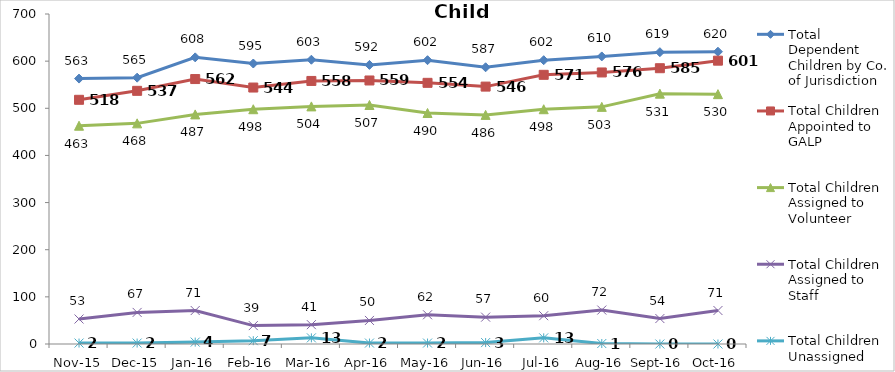
| Category | Total Dependent Children by Co. of Jurisdiction | Total Children Appointed to GALP | Total Children Assigned to Volunteer | Total Children Assigned to Staff | Total Children Unassigned |
|---|---|---|---|---|---|
| Nov-15 | 563 | 518 | 463 | 53 | 2 |
| Dec-15 | 565 | 537 | 468 | 67 | 2 |
| Jan-16 | 608 | 562 | 487 | 71 | 4 |
| Feb-16 | 595 | 544 | 498 | 39 | 7 |
| Mar-16 | 603 | 558 | 504 | 41 | 13 |
| Apr-16 | 592 | 559 | 507 | 50 | 2 |
| May-16 | 602 | 554 | 490 | 62 | 2 |
| Jun-16 | 587 | 546 | 486 | 57 | 3 |
| Jul-16 | 602 | 571 | 498 | 60 | 13 |
| Aug-16 | 610 | 576 | 503 | 72 | 1 |
| Sep-16 | 619 | 585 | 531 | 54 | 0 |
| Oct-16 | 620 | 601 | 530 | 71 | 0 |